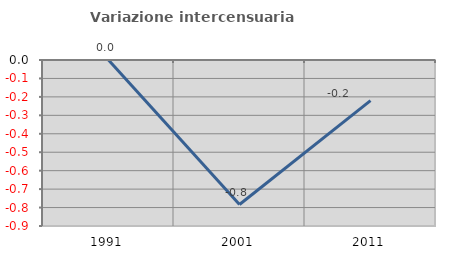
| Category | Variazione intercensuaria annua |
|---|---|
| 1991.0 | 0 |
| 2001.0 | -0.784 |
| 2011.0 | -0.22 |